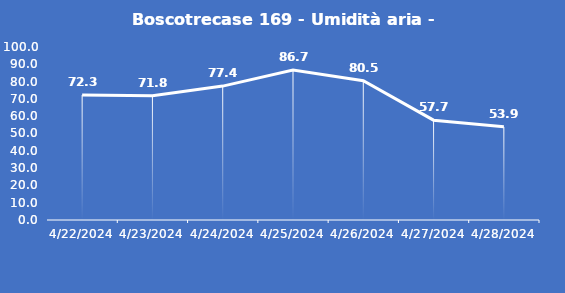
| Category | Boscotrecase 169 - Umidità aria - Grezzo (%) |
|---|---|
| 4/22/24 | 72.3 |
| 4/23/24 | 71.8 |
| 4/24/24 | 77.4 |
| 4/25/24 | 86.7 |
| 4/26/24 | 80.5 |
| 4/27/24 | 57.7 |
| 4/28/24 | 53.9 |